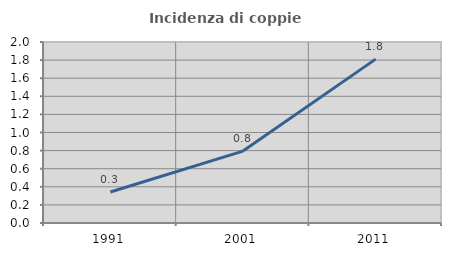
| Category | Incidenza di coppie miste |
|---|---|
| 1991.0 | 0.343 |
| 2001.0 | 0.794 |
| 2011.0 | 1.811 |